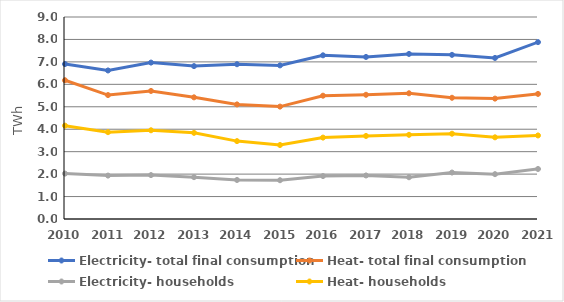
| Category | Electricity- total final consumption | Heat- total final consumption | Electricity- households | Heat- households |
|---|---|---|---|---|
| 2010 | 6.904 | 6.182 | 2.023 | 4.159 |
| 2011 | 6.618 | 5.522 | 1.934 | 3.869 |
| 2012 | 6.969 | 5.706 | 1.956 | 3.953 |
| 2013 | 6.812 | 5.42 | 1.865 | 3.839 |
| 2014 | 6.896 | 5.105 | 1.739 | 3.47 |
| 2015 | 6.844 | 5.008 | 1.728 | 3.297 |
| 2016 | 7.293 | 5.494 | 1.913 | 3.627 |
| 2017 | 7.221 | 5.534 | 1.94 | 3.7 |
| 2018 | 7.355 | 5.601 | 1.86 | 3.75 |
| 2019 | 7.313 | 5.402 | 2.07 | 3.8 |
| 2020 | 7.176 | 5.364 | 1.998 | 3.639 |
| 2021 | 7.881 | 5.573 | 2.229 | 3.722 |